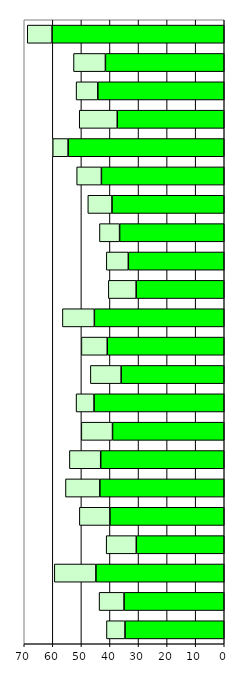
| Category | Series 0 | Series 1 |
|---|---|---|
| 0 | 34.735 | 6.492 |
| 1 | 35.067 | 8.741 |
| 2 | 44.92 | 14.551 |
| 3 | 30.783 | 10.544 |
| 4 | 40.012 | 10.696 |
| 5 | 43.537 | 12.035 |
| 6 | 43.238 | 10.962 |
| 7 | 39.101 | 10.914 |
| 8 | 45.58 | 6.281 |
| 9 | 36.09 | 10.769 |
| 10 | 40.949 | 9.042 |
| 11 | 45.46 | 11.183 |
| 12 | 30.837 | 9.731 |
| 13 | 33.574 | 7.702 |
| 14 | 36.627 | 7.048 |
| 15 | 39.296 | 8.447 |
| 16 | 42.991 | 8.659 |
| 17 | 54.653 | 5.373 |
| 18 | 37.444 | 13.313 |
| 19 | 44.253 | 7.602 |
| 20 | 41.59 | 11.164 |
| 21 | 60.264 | 8.676 |